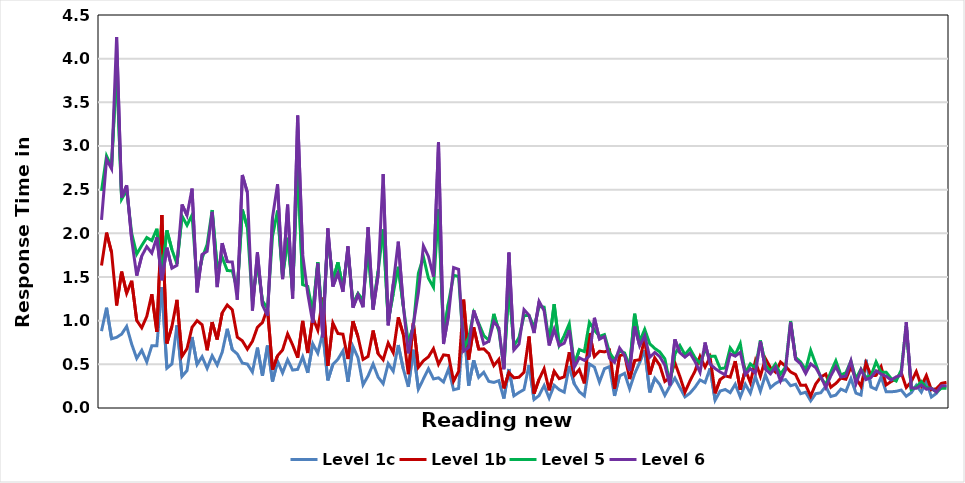
| Category | Level 1c | Level 1b | Level 5 | Level 6 |
|---|---|---|---|---|
| CR545Q02T | 0.88 | 1.631 | 2.486 | 2.153 |
| CR559Q08T | 1.149 | 2.008 | 2.885 | 2.847 |
| CR553Q04T | 0.793 | 1.781 | 2.762 | 2.739 |
| CR552Q03T | 0.809 | 1.174 | 3.924 | 4.249 |
| CR565Q02T | 0.846 | 1.562 | 2.391 | 2.409 |
| CR566Q03T | 0.934 | 1.314 | 2.492 | 2.549 |
| CR546Q03T | 0.731 | 1.457 | 2 | 1.927 |
| CR560Q03T | 0.568 | 1.002 | 1.764 | 1.516 |
| CR558Q02T | 0.661 | 0.918 | 1.86 | 1.74 |
| CR561Q01T | 0.527 | 1.049 | 1.951 | 1.848 |
| CR559Q01T | 0.712 | 1.303 | 1.917 | 1.774 |
| CR544Q04T | 0.712 | 0.872 | 2.052 | 1.954 |
| CR545Q04T | 1.386 | 2.211 | 1.518 | 1.463 |
| CR563Q12T | 0.456 | 0.739 | 2.034 | 1.835 |
| CR549Q04T | 0.505 | 0.935 | 1.813 | 1.601 |
| CR550Q09T | 0.947 | 1.238 | 1.65 | 1.635 |
| CR550Q07T | 0.362 | 0.592 | 2.199 | 2.331 |
| CR556Q09T | 0.428 | 0.679 | 2.094 | 2.205 |
| CR558Q12T | 0.813 | 0.924 | 2.209 | 2.513 |
| CR543Q01T | 0.498 | 1 | 1.445 | 1.323 |
| CR565Q05T | 0.588 | 0.953 | 1.715 | 1.759 |
| CR544Q10T | 0.454 | 0.661 | 1.873 | 1.793 |
| CR567Q03T | 0.598 | 0.984 | 2.267 | 2.246 |
| CR564Q01T | 0.492 | 0.784 | 1.598 | 1.385 |
| CR540Q04T | 0.64 | 1.091 | 1.725 | 1.888 |
| CR558Q04T | 0.907 | 1.18 | 1.574 | 1.677 |
| CR564Q05T | 0.668 | 1.125 | 1.571 | 1.672 |
| CR547Q10T | 0.619 | 0.811 | 1.35 | 1.24 |
| CR552Q04T | 0.514 | 0.769 | 2.271 | 2.669 |
| CR543Q15T | 0.503 | 0.674 | 2.068 | 2.469 |
| CR560Q10T | 0.412 | 0.763 | 1.222 | 1.116 |
| CR562Q03T | 0.691 | 0.925 | 1.663 | 1.781 |
| CR570Q04T | 0.369 | 0.979 | 1.227 | 1.179 |
| CR545Q03T | 0.715 | 1.141 | 1.138 | 1.057 |
| CR544Q13T | 0.303 | 0.438 | 1.968 | 2.183 |
| CR573Q06T | 0.536 | 0.599 | 2.26 | 2.562 |
| CR568Q05T | 0.402 | 0.664 | 1.498 | 1.476 |
| CR561Q07T | 0.552 | 0.848 | 1.949 | 2.329 |
| CR556Q01T | 0.434 | 0.722 | 1.344 | 1.254 |
| CR568Q13T | 0.442 | 0.576 | 2.786 | 3.348 |
| CR549Q05T | 0.586 | 0.997 | 1.413 | 1.756 |
| CR551Q06T | 0.402 | 0.63 | 1.392 | 1.31 |
| CR547Q09T | 0.736 | 1.034 | 1.098 | 0.975 |
| CR568Q06T | 0.627 | 0.892 | 1.67 | 1.655 |
| CR542Q09T | 0.863 | 1.263 | 0.931 | 0.81 |
| CR541Q11T | 0.316 | 0.483 | 1.976 | 2.057 |
| CR569Q06T | 0.498 | 0.973 | 1.46 | 1.39 |
| CR540Q01T | 0.559 | 0.853 | 1.668 | 1.544 |
| CR547Q07T | 0.654 | 0.845 | 1.378 | 1.329 |
| CR541Q04T | 0.3 | 0.56 | 1.802 | 1.852 |
| CR565Q01T | 0.703 | 0.994 | 1.183 | 1.149 |
| CR551Q01T | 0.575 | 0.815 | 1.311 | 1.297 |
| CR543Q09T | 0.265 | 0.556 | 1.234 | 1.154 |
| CR544Q07T | 0.368 | 0.59 | 1.799 | 2.07 |
| CR550Q10T | 0.504 | 0.888 | 1.15 | 1.127 |
| CR556Q04T | 0.353 | 0.621 | 1.567 | 1.523 |
| CR551Q11T | 0.278 | 0.552 | 2.045 | 2.677 |
| CR558Q06T | 0.508 | 0.744 | 0.995 | 0.947 |
| CR562Q06T | 0.421 | 0.633 | 1.31 | 1.42 |
| CR542Q02T | 0.721 | 1.038 | 1.618 | 1.904 |
| CR551Q05T | 0.449 | 0.844 | 1.165 | 1.178 |
| CR541Q05T | 0.242 | 0.387 | 0.751 | 0.626 |
| CR563Q09T | 0.666 | 0.975 | 0.932 | 0.955 |
| CR570Q06T | 0.216 | 0.466 | 1.543 | 1.322 |
| CR573Q01T | 0.333 | 0.541 | 1.731 | 1.857 |
| CR552Q08T | 0.449 | 0.586 | 1.485 | 1.736 |
| CR567Q08T | 0.333 | 0.679 | 1.381 | 1.505 |
| CR554Q07T | 0.345 | 0.501 | 2.275 | 3.042 |
| CR551Q10T | 0.298 | 0.608 | 0.833 | 0.732 |
| CR562Q02T | 0.448 | 0.601 | 1.207 | 1.064 |
| CR566Q09T | 0.208 | 0.308 | 1.519 | 1.608 |
| CR541Q09T | 0.224 | 0.419 | 1.505 | 1.588 |
| CR569Q02T | 0.992 | 1.241 | 0.675 | 0.651 |
| CR559Q06T | 0.256 | 0.555 | 0.803 | 0.694 |
| CR569Q01T | 0.546 | 0.924 | 1.094 | 1.118 |
| CR547Q06T | 0.351 | 0.673 | 0.969 | 0.948 |
| CR560Q08T | 0.409 | 0.677 | 0.831 | 0.733 |
| CR549Q10T | 0.305 | 0.623 | 0.774 | 0.763 |
| CR541Q01T | 0.293 | 0.486 | 1.078 | 0.99 |
| CR568Q14T | 0.313 | 0.556 | 0.884 | 0.917 |
| CR543Q13T | 0.107 | 0.224 | 0.461 | 0.443 |
| CR566Q12T | 0.446 | 0.407 | 1.4 | 1.78 |
| CR561Q06T | 0.139 | 0.346 | 0.713 | 0.665 |
| CR550Q04T | 0.177 | 0.352 | 0.805 | 0.731 |
| CR554Q03T | 0.211 | 0.409 | 1.057 | 1.126 |
| CR565Q03T | 0.493 | 0.819 | 1.06 | 1.062 |
| CR550Q06T | 0.097 | 0.165 | 0.923 | 0.858 |
| CR554Q05T | 0.143 | 0.329 | 1.162 | 1.221 |
| CR567Q11T | 0.258 | 0.449 | 1.155 | 1.113 |
| CR562Q05T | 0.113 | 0.202 | 0.752 | 0.716 |
| CR568Q08T | 0.26 | 0.421 | 1.188 | 0.901 |
| CR551Q08T | 0.21 | 0.336 | 0.718 | 0.713 |
| CR568Q10T | 0.181 | 0.357 | 0.829 | 0.742 |
| CR558Q10T | 0.482 | 0.638 | 0.964 | 0.892 |
| CR552Q06T | 0.276 | 0.374 | 0.492 | 0.468 |
| CR563Q07T | 0.186 | 0.441 | 0.669 | 0.575 |
| CR558Q09T | 0.139 | 0.282 | 0.646 | 0.545 |
| CR553Q02T | 0.505 | 0.858 | 0.98 | 0.596 |
| CR556Q12T | 0.468 | 0.59 | 0.892 | 1.033 |
| CR542Q08T | 0.296 | 0.65 | 0.82 | 0.788 |
| CR552Q01T | 0.45 | 0.642 | 0.841 | 0.818 |
| CR546Q01T | 0.474 | 0.664 | 0.636 | 0.569 |
| CR553Q07T | 0.139 | 0.219 | 0.55 | 0.522 |
| CR561Q04T | 0.368 | 0.599 | 0.653 | 0.687 |
| CR560Q06T | 0.397 | 0.615 | 0.63 | 0.605 |
| CR554Q02T | 0.22 | 0.331 | 0.477 | 0.426 |
| CR570Q10T | 0.393 | 0.544 | 1.079 | 0.933 |
| CR544Q14T | 0.52 | 0.552 | 0.761 | 0.712 |
| CR570Q01T | 0.662 | 0.796 | 0.901 | 0.829 |
| CR564Q03T | 0.178 | 0.384 | 0.736 | 0.58 |
| CR559Q04T | 0.341 | 0.573 | 0.682 | 0.636 |
| CR559Q03T | 0.268 | 0.489 | 0.642 | 0.588 |
| CR563Q03T | 0.145 | 0.304 | 0.563 | 0.49 |
| CR566Q14T | 0.25 | 0.346 | 0.283 | 0.26 |
| CR552Q09T | 0.343 | 0.518 | 0.616 | 0.786 |
| CR544Q12T | 0.234 | 0.359 | 0.715 | 0.633 |
| CR566Q05T | 0.127 | 0.181 | 0.611 | 0.582 |
| CR563Q02T | 0.17 | 0.31 | 0.68 | 0.628 |
| CR543Q03T | 0.237 | 0.423 | 0.576 | 0.532 |
| CR542Q05T | 0.321 | 0.591 | 0.512 | 0.409 |
| CR565Q09T | 0.291 | 0.468 | 0.662 | 0.75 |
| CR547Q02T | 0.454 | 0.581 | 0.59 | 0.503 |
| CR568Q15T | 0.09 | 0.168 | 0.593 | 0.452 |
| CR543Q10T | 0.193 | 0.327 | 0.451 | 0.412 |
| CR546Q04T | 0.212 | 0.367 | 0.459 | 0.38 |
| CR556Q03T | 0.176 | 0.353 | 0.688 | 0.62 |
| CR553Q05T | 0.272 | 0.537 | 0.609 | 0.594 |
| CR561Q08T | 0.126 | 0.209 | 0.738 | 0.637 |
| CR549Q12T | 0.273 | 0.442 | 0.399 | 0.382 |
| CR550Q05T | 0.17 | 0.292 | 0.505 | 0.45 |
| CR545Q06T | 0.361 | 0.538 | 0.459 | 0.398 |
| CR540Q05T | 0.192 | 0.362 | 0.774 | 0.763 |
| CR554Q01T | 0.379 | 0.567 | 0.492 | 0.444 |
| CR561Q03T | 0.233 | 0.462 | 0.42 | 0.391 |
| CR547Q03T | 0.281 | 0.411 | 0.504 | 0.471 |
| CR542Q01T | 0.313 | 0.527 | 0.387 | 0.308 |
| CR565Q08T | 0.325 | 0.478 | 0.468 | 0.435 |
| CR566Q06T | 0.255 | 0.413 | 0.995 | 0.982 |
| CR549Q13T | 0.272 | 0.383 | 0.579 | 0.556 |
| CR573Q04T | 0.164 | 0.26 | 0.527 | 0.506 |
| CR566Q04T | 0.181 | 0.262 | 0.437 | 0.395 |
| CR567Q06T | 0.082 | 0.136 | 0.66 | 0.506 |
| CR573Q03T | 0.164 | 0.275 | 0.504 | 0.462 |
| CR541Q03T | 0.174 | 0.353 | 0.348 | 0.362 |
| CR564Q02T | 0.247 | 0.388 | 0.268 | 0.235 |
| CR556Q10T | 0.132 | 0.238 | 0.412 | 0.368 |
| CR567Q04T | 0.148 | 0.282 | 0.541 | 0.474 |
| CR540Q06T | 0.216 | 0.342 | 0.378 | 0.355 |
| CR549Q06T | 0.19 | 0.329 | 0.404 | 0.366 |
| CR545Q07T | 0.337 | 0.469 | 0.537 | 0.54 |
| CR564Q04T | 0.171 | 0.343 | 0.334 | 0.276 |
| CR551Q09T | 0.148 | 0.248 | 0.446 | 0.438 |
| CR544Q06T | 0.553 | 0.513 | 0.35 | 0.326 |
| CR540Q03T | 0.24 | 0.371 | 0.369 | 0.349 |
| CR543Q04T | 0.214 | 0.374 | 0.529 | 0.426 |
| CR569Q04T | 0.357 | 0.473 | 0.408 | 0.388 |
| CR567Q13T | 0.187 | 0.264 | 0.41 | 0.363 |
| CR546Q07T | 0.185 | 0.303 | 0.338 | 0.32 |
| CR562Q07T | 0.191 | 0.336 | 0.309 | 0.357 |
| CR570Q05T | 0.206 | 0.407 | 0.435 | 0.375 |
| CR541Q10T | 0.134 | 0.235 | 0.944 | 0.982 |
| CR556Q05T | 0.175 | 0.301 | 0.212 | 0.23 |
| CR563Q10T | 0.26 | 0.417 | 0.24 | 0.226 |
| CR573Q02T | 0.181 | 0.255 | 0.302 | 0.263 |
| CR570Q02T | 0.304 | 0.372 | 0.232 | 0.215 |
| CR567Q10T | 0.125 | 0.209 | 0.226 | 0.226 |
| CR570Q08T | 0.168 | 0.221 | 0.182 | 0.182 |
| CR569Q03T | 0.249 | 0.282 | 0.227 | 0.255 |
| CR553Q01T | 0.251 | 0.294 | 0.227 | 0.255 |